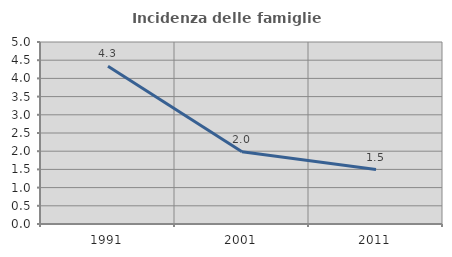
| Category | Incidenza delle famiglie numerose |
|---|---|
| 1991.0 | 4.333 |
| 2001.0 | 1.985 |
| 2011.0 | 1.496 |